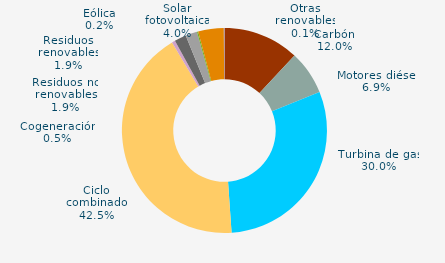
| Category | Series 0 |
|---|---|
| Carbón | 11.962 |
| Motores diésel | 6.913 |
| Turbina de gas | 30.024 |
| Ciclo combinado | 42.549 |
| Generación auxiliar | 0 |
| Cogeneración | 0.52 |
| Residuos no renovables | 1.855 |
| Residuos renovables | 1.855 |
| Eólica | 0.18 |
| Solar fotovoltaica | 4.036 |
| Otras renovables | 0.106 |